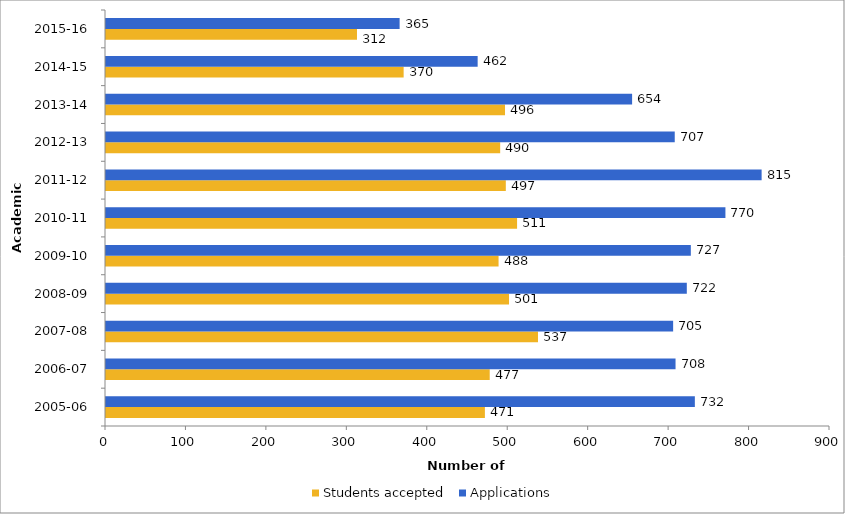
| Category | Students accepted | Applications |
|---|---|---|
| 2005-06 | 471 | 732 |
| 2006-07 | 477 | 708 |
| 2007-08 | 537 | 705 |
| 2008-09 | 501 | 722 |
| 2009-10 | 488 | 727 |
| 2010-11 | 511 | 770 |
| 2011-12 | 497 | 815 |
| 2012-13 | 490 | 707 |
| 2013-14 | 496 | 654 |
| 2014-15 | 370 | 462 |
| 2015-16 | 312 | 365 |